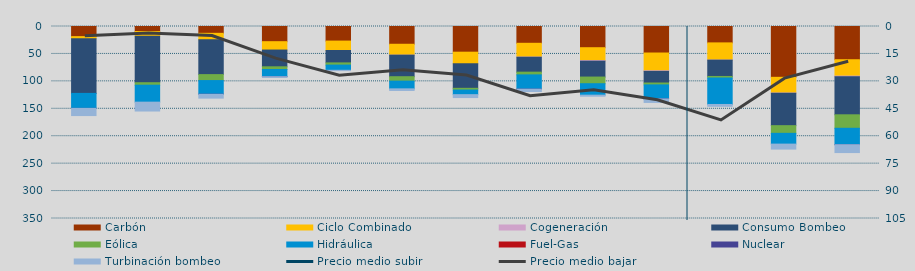
| Category | Carbón | Ciclo Combinado | Cogeneración | Consumo Bombeo | Eólica | Hidráulica | Fuel-Gas | Nuclear | Turbinación bombeo |
|---|---|---|---|---|---|---|---|---|---|
| M | 18462.8 | 3751.2 | 0 | 99732.8 | 0 | 27305.6 | 0 | 8.3 | 13117.3 |
| A | 9128.2 | 8591.4 | 0 | 84739.1 | 4519.6 | 30920 | 0 | 0 | 16195.4 |
| M | 12444.9 | 11889.1 | 0 | 63369.7 | 10841.6 | 24843.5 | 0 | 260 | 6935.7 |
| J | 27670.2 | 15256.9 | 0 | 30546.6 | 4860.6 | 13133.6 | 0 | 35 | 583.9 |
| J | 26575.7 | 17125.2 | 0 | 22647.3 | 4001.3 | 9478.8 | 0 | 0 | 608.4 |
| A | 32372.1 | 19882 | 0.8 | 39268.2 | 8039.4 | 14094.1 | 0 | 0 | 2953 |
| S | 46810.1 | 21088.9 | 0 | 44806.4 | 3126.2 | 8427.2 | 0 | 0 | 5288 |
| O | 30606.2 | 25077.2 | 351.5 | 27192.1 | 4972 | 25903.4 | 0 | 171.9 | 4234.4 |
| N | 38654 | 23471.9 | 1088.5 | 28952.2 | 12138.1 | 20858.9 | 0 | 0 | 1910.4 |
| D | 48332.5 | 32343 | 1137.1 | 21197.2 | 3426.7 | 25403.7 | 0 | 222 | 6361.9 |
| E | 29873.4 | 31257.5 | 232.7 | 29718.6 | 2813.5 | 48230.3 | 0 | 0 | 3337.1 |
| F | 92635.5 | 28594.2 | 463.1 | 59071.9 | 13978.3 | 19654.8 | 0 | 0 | 9063.5 |
| M | 60556.8 | 29853.7 | 1006.6 | 69541.7 | 24572.7 | 29936.2 | 0 | 30 | 14315.8 |